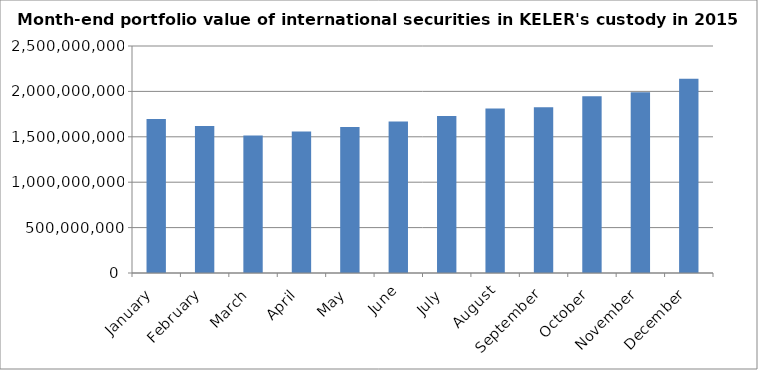
| Category | Portfolio value |
|---|---|
| January | 1695187473.392 |
| February | 1619931068.731 |
| March | 1513547599.472 |
| April | 1559155593.361 |
| May | 1608913790.433 |
| June | 1667161506.798 |
| July | 1728704441.381 |
| August | 1812941101.297 |
| September | 1825986805.331 |
| October | 1947551278.458 |
| November | 1991317482.644 |
| December | 2138102292.913 |